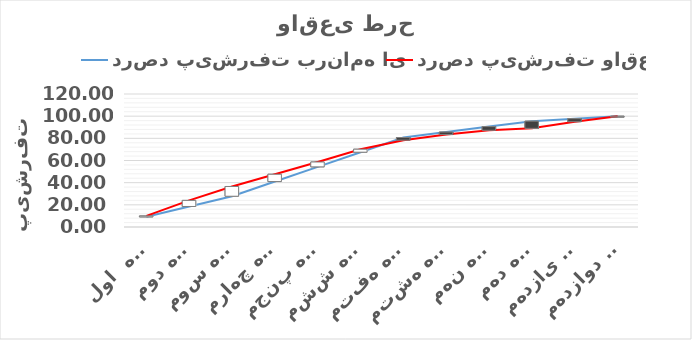
| Category | درصد پیشرفت برنامه ای  | درصد پیشرفت واقعی |
|---|---|---|
| ماه  اول | 9.25 | 10 |
| ماه دوم | 18.5 | 24 |
| ماه سوم | 27.75 | 36.55 |
| ماه چهارم | 41 | 47.6 |
| ماه پنجم | 54.25 | 58.65 |
| ماه ششم | 67.5 | 70.2 |
| ماه هفتم | 80.75 | 78.35 |
| ماه هشتم | 85.667 | 83.4 |
| ماه نهم | 90.583 | 87.25 |
| ماه دهم | 95.5 | 89 |
| ماه یازدهم | 97.75 | 95 |
| ماه دوازدهم | 100 | 100 |